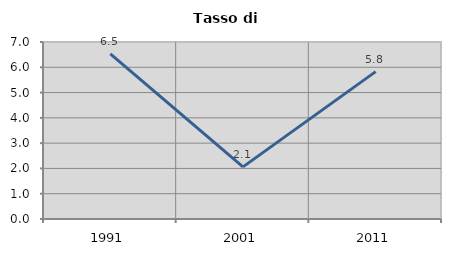
| Category | Tasso di disoccupazione   |
|---|---|
| 1991.0 | 6.526 |
| 2001.0 | 2.061 |
| 2011.0 | 5.828 |